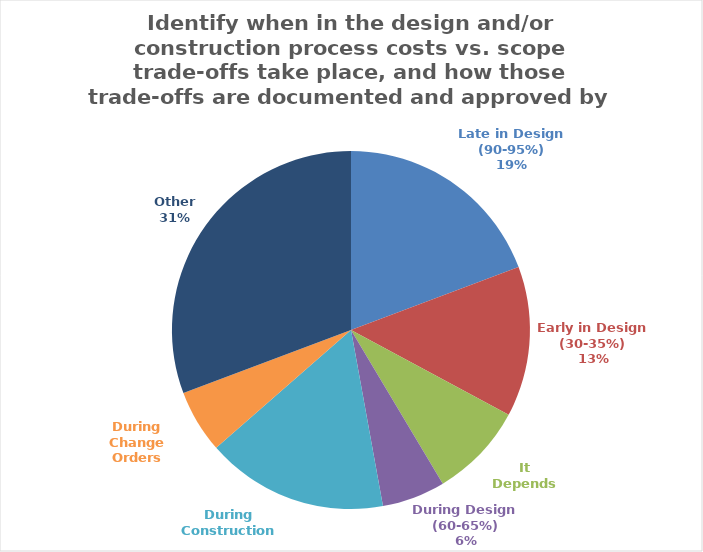
| Category | Series 0 |
|---|---|
| Late in Design
(90-95%) | 0.193 |
| Early in Design
(30-35%) | 0.136 |
| It Depends | 0.086 |
| During Design
(60-65%) | 0.057 |
| During Construction | 0.164 |
| During Change Orders | 0.057 |
| Other | 0.307 |